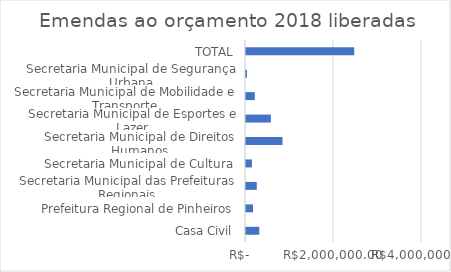
| Category | Series 0 |
|---|---|
| Casa Civil | 301598.46 |
| Prefeitura Regional de Pinheiros | 160000 |
| Secretaria Municipal das Prefeituras Regionais | 245000 |
| Secretaria Municipal de Cultura | 135000 |
| Secretaria Municipal de Direitos Humanos | 830000 |
| Secretaria Municipal de Esportes e Lazer | 565300 |
| Secretaria Municipal de Mobilidade e Transporte | 200000 |
| Secretaria Municipal de Segurança Urbana | 22332 |
| TOTAL | 2459230.46 |